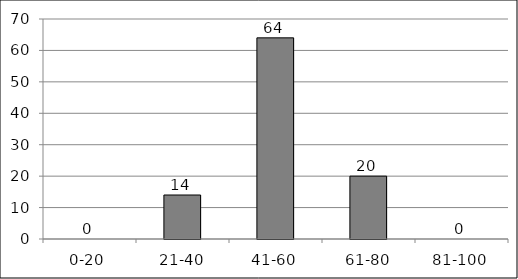
| Category | Series 0 |
|---|---|
| 0-20 | 0 |
| 21-40 | 14 |
| 41-60 | 64 |
| 61-80 | 20 |
| 81-100 | 0 |